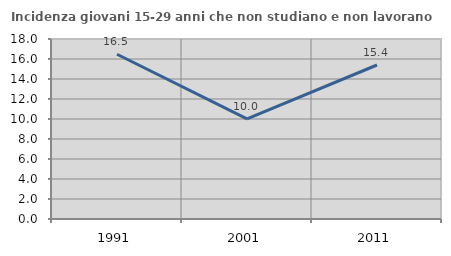
| Category | Incidenza giovani 15-29 anni che non studiano e non lavorano  |
|---|---|
| 1991.0 | 16.475 |
| 2001.0 | 10.017 |
| 2011.0 | 15.399 |